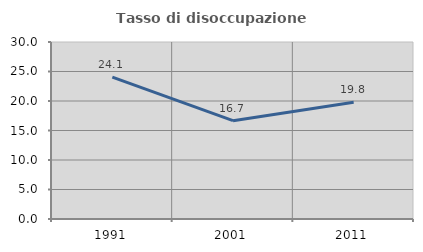
| Category | Tasso di disoccupazione giovanile  |
|---|---|
| 1991.0 | 24.06 |
| 2001.0 | 16.667 |
| 2011.0 | 19.792 |